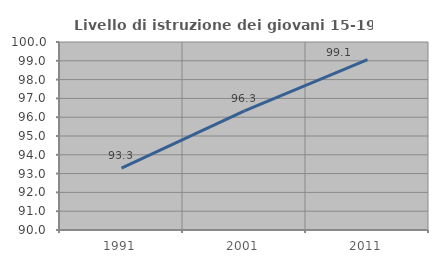
| Category | Livello di istruzione dei giovani 15-19 anni |
|---|---|
| 1991.0 | 93.29 |
| 2001.0 | 96.341 |
| 2011.0 | 99.067 |